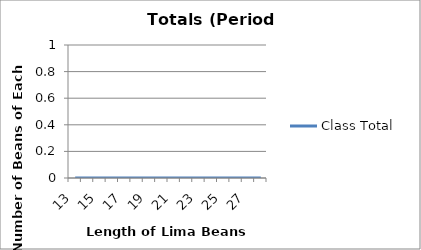
| Category | Class Total |
|---|---|
| 13.0 | 0 |
| 14.0 | 0 |
| 15.0 | 0 |
| 16.0 | 0 |
| 17.0 | 0 |
| 18.0 | 0 |
| 19.0 | 0 |
| 20.0 | 0 |
| 21.0 | 0 |
| 22.0 | 0 |
| 23.0 | 0 |
| 24.0 | 0 |
| 25.0 | 0 |
| 26.0 | 0 |
| 27.0 | 0 |
| 28.0 | 0 |